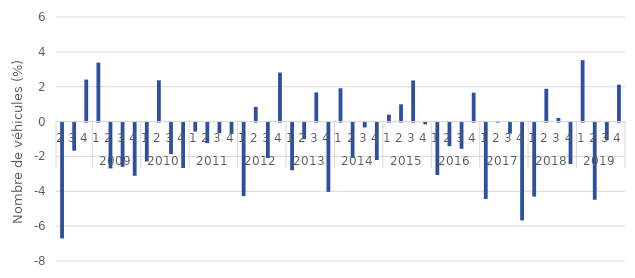
| Category | évolution trimestrielle (%) |
|---|---|
| 0 | -6.65 |
| 1 | -1.615 |
| 2 | 2.408 |
| 3 | 3.383 |
| 4 | -2.63 |
| 5 | -2.54 |
| 6 | -3.053 |
| 7 | -2.231 |
| 8 | 2.367 |
| 9 | -1.815 |
| 10 | -2.606 |
| 11 | -0.514 |
| 12 | -1.178 |
| 13 | -0.614 |
| 14 | -0.65 |
| 15 | -4.222 |
| 16 | 0.846 |
| 17 | -2.032 |
| 18 | 2.813 |
| 19 | -2.736 |
| 20 | -0.955 |
| 21 | 1.671 |
| 22 | -3.976 |
| 23 | 1.911 |
| 24 | -2.027 |
| 25 | -0.28 |
| 26 | -2.147 |
| 27 | 0.4 |
| 28 | 0.992 |
| 29 | 2.358 |
| 30 | -0.107 |
| 31 | -3.005 |
| 32 | -1.355 |
| 33 | -1.501 |
| 34 | 1.656 |
| 35 | -4.381 |
| 36 | 0.037 |
| 37 | -0.635 |
| 38 | -5.612 |
| 39 | -4.249 |
| 40 | 1.879 |
| 41 | 0.208 |
| 42 | -2.383 |
| 43 | 3.522 |
| 44 | -4.431 |
| 45 | -1.007 |
| 46 | 2.116 |